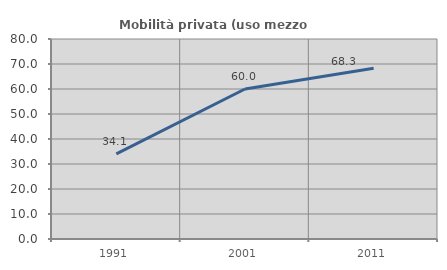
| Category | Mobilità privata (uso mezzo privato) |
|---|---|
| 1991.0 | 34.074 |
| 2001.0 | 60 |
| 2011.0 | 68.276 |